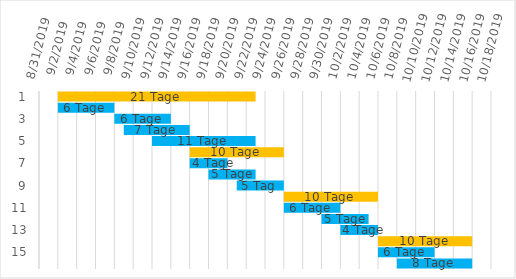
| Category | Series 0 | Dauer |
|---|---|---|
| 0 | 9/2/19 | 21 |
| 1 | 9/2/19 | 6 |
| 2 | 9/8/19 | 6 |
| 3 | 9/9/19 | 7 |
| 4 | 9/12/19 | 11 |
| 5 | 9/16/19 | 10 |
| 6 | 9/16/19 | 4 |
| 7 | 9/18/19 | 5 |
| 8 | 9/21/19 | 5 |
| 9 | 9/26/19 | 10 |
| 10 | 9/26/19 | 6 |
| 11 | 9/30/19 | 5 |
| 12 | 10/2/19 | 4 |
| 13 | 10/6/19 | 10 |
| 14 | 10/6/19 | 6 |
| 15 | 10/8/19 | 8 |